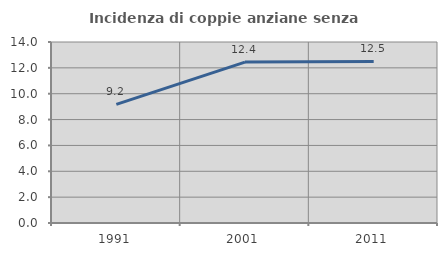
| Category | Incidenza di coppie anziane senza figli  |
|---|---|
| 1991.0 | 9.17 |
| 2001.0 | 12.448 |
| 2011.0 | 12.5 |